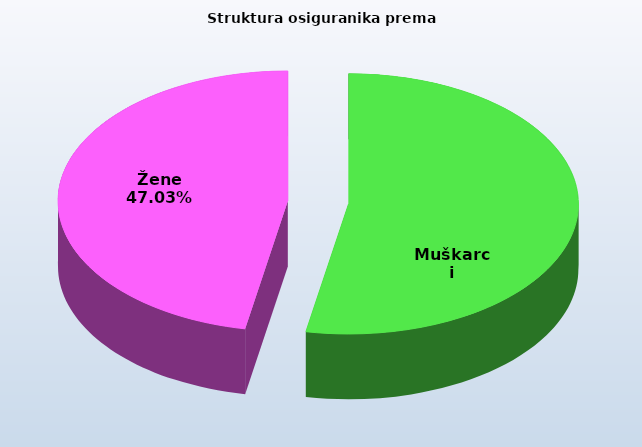
| Category | Series 0 |
|---|---|
| Muškarci | 813779 |
| Žene | 722468 |